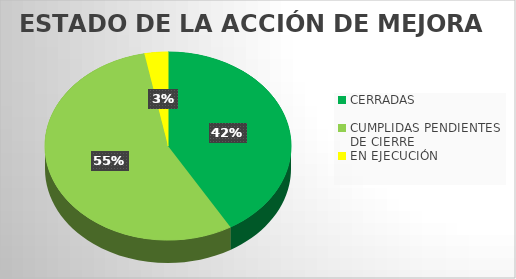
| Category | Series 0 |
|---|---|
| CERRADAS  | 27 |
| CUMPLIDAS PENDIENTES DE CIERRE | 36 |
| EN EJECUCIÓN | 2 |